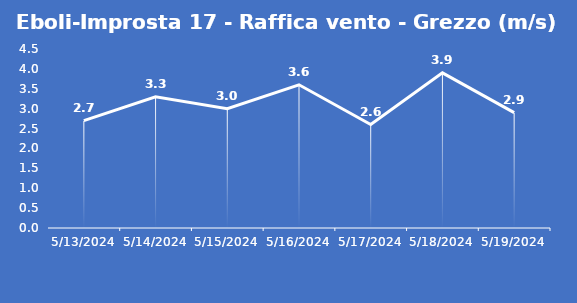
| Category | Eboli-Improsta 17 - Raffica vento - Grezzo (m/s) |
|---|---|
| 5/13/24 | 2.7 |
| 5/14/24 | 3.3 |
| 5/15/24 | 3 |
| 5/16/24 | 3.6 |
| 5/17/24 | 2.6 |
| 5/18/24 | 3.9 |
| 5/19/24 | 2.9 |